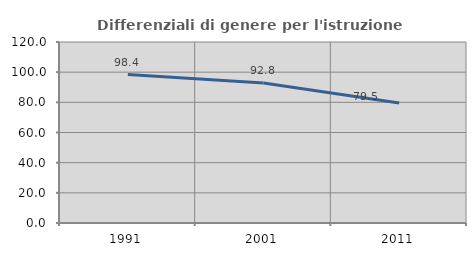
| Category | Differenziali di genere per l'istruzione superiore |
|---|---|
| 1991.0 | 98.429 |
| 2001.0 | 92.82 |
| 2011.0 | 79.529 |